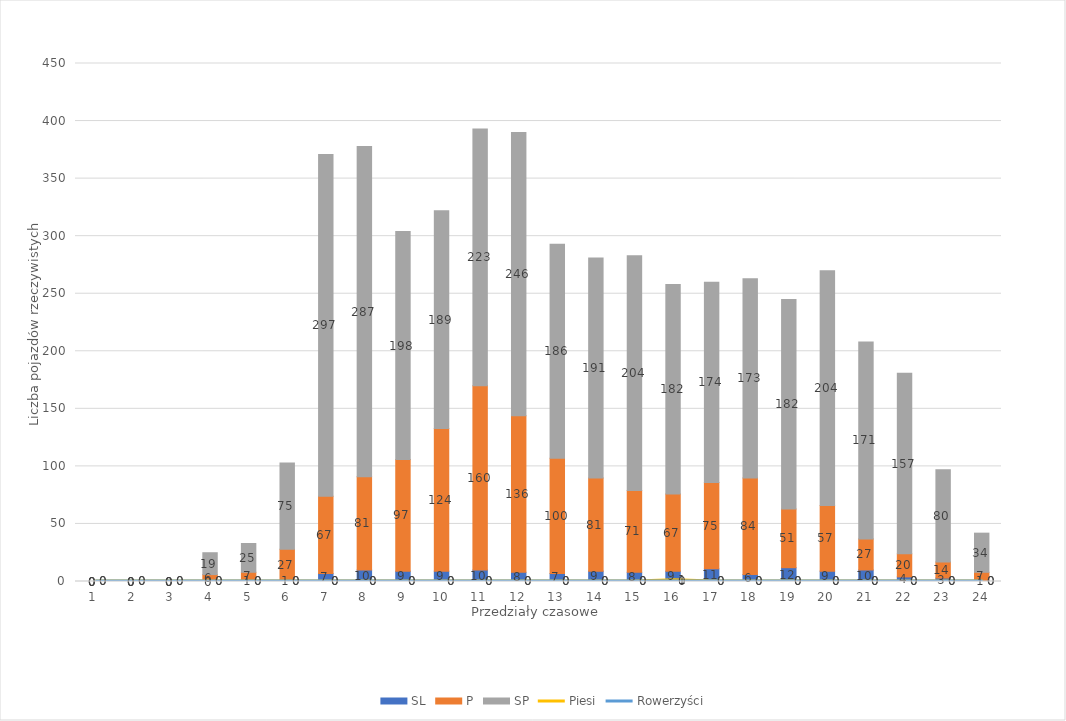
| Category | SL | P | SP |
|---|---|---|---|
| 0 | 0 | 0 | 0 |
| 1 | 0 | 0 | 0 |
| 2 | 0 | 0 | 0 |
| 3 | 0 | 6 | 19 |
| 4 | 1 | 7 | 25 |
| 5 | 1 | 27 | 75 |
| 6 | 7 | 67 | 297 |
| 7 | 10 | 81 | 287 |
| 8 | 9 | 97 | 198 |
| 9 | 9 | 124 | 189 |
| 10 | 10 | 160 | 223 |
| 11 | 8 | 136 | 246 |
| 12 | 7 | 100 | 186 |
| 13 | 9 | 81 | 191 |
| 14 | 8 | 71 | 204 |
| 15 | 9 | 67 | 182 |
| 16 | 11 | 75 | 174 |
| 17 | 6 | 84 | 173 |
| 18 | 12 | 51 | 182 |
| 19 | 9 | 57 | 204 |
| 20 | 10 | 27 | 171 |
| 21 | 4 | 20 | 157 |
| 22 | 3 | 14 | 80 |
| 23 | 1 | 7 | 34 |